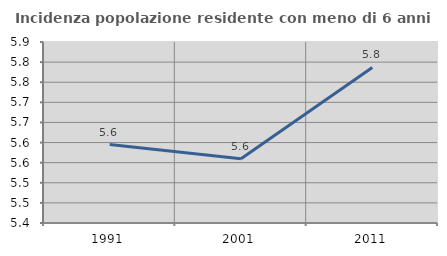
| Category | Incidenza popolazione residente con meno di 6 anni |
|---|---|
| 1991.0 | 5.595 |
| 2001.0 | 5.559 |
| 2011.0 | 5.787 |